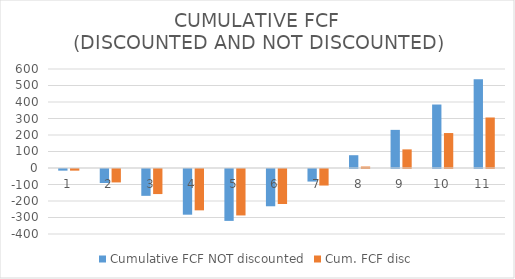
| Category | Cumulative FCF NOT discounted | Cum. FCF disc |
|---|---|---|
| 0 | -10 | -10 |
| 1 | -84.9 | -81.333 |
| 2 | -162.7 | -151.9 |
| 3 | -276.9 | -250.55 |
| 4 | -314.5 | -281.484 |
| 5 | -225.9 | -212.064 |
| 6 | -76.1 | -100.281 |
| 7 | 77.5 | 8.88 |
| 8 | 231.1 | 112.843 |
| 9 | 384.7 | 211.854 |
| 10 | 538.3 | 306.152 |